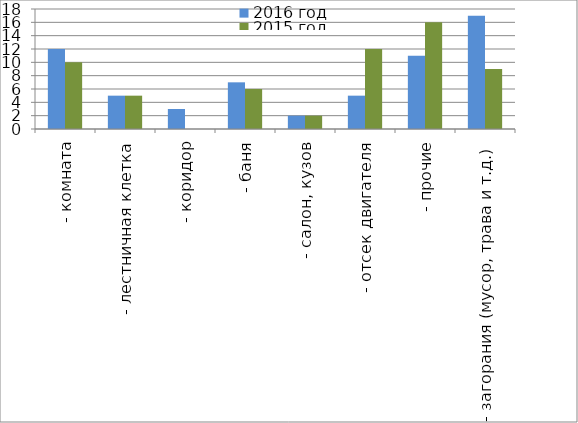
| Category | 2016 год | 2015 год |
|---|---|---|
|  - комната | 12 | 10 |
|  - лестничная клетка | 5 | 5 |
|  - коридор | 3 | 0 |
|  - баня | 7 | 6 |
|  - салон, кузов | 2 | 2 |
|  - отсек двигателя | 5 | 12 |
| - прочие | 11 | 16 |
| - загорания (мусор, трава и т.д.)  | 17 | 9 |